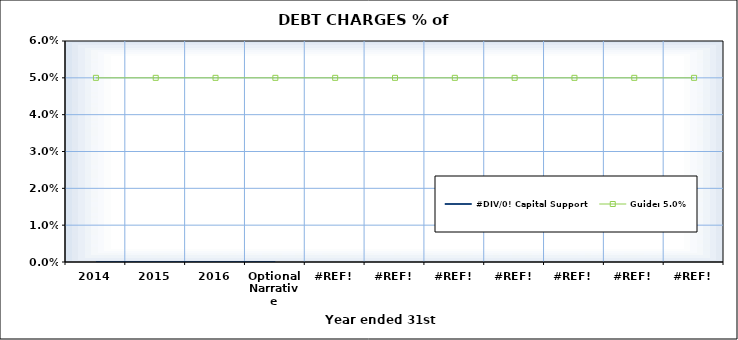
| Category | #DIV/0! Capital Support | Guide: 5.0% |
|---|---|---|
| 2014 |  | 0.05 |
| 2015 |  | 0.05 |
| 2016 |  | 0.05 |
| Optional Narrative |  | 0.05 |
| #REF! |  | 0.05 |
| #REF! |  | 0.05 |
| #REF! |  | 0.05 |
| #REF! |  | 0.05 |
| #REF! |  | 0.05 |
| #REF! |  | 0.05 |
| #REF! |  | 0.05 |